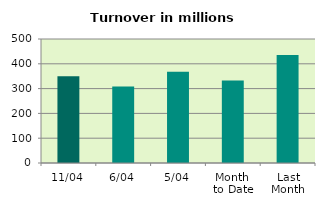
| Category | Series 0 |
|---|---|
| 11/04 | 350.149 |
| 6/04 | 308.919 |
| 5/04 | 368.098 |
| Month 
to Date | 332.397 |
| Last
Month | 435.216 |